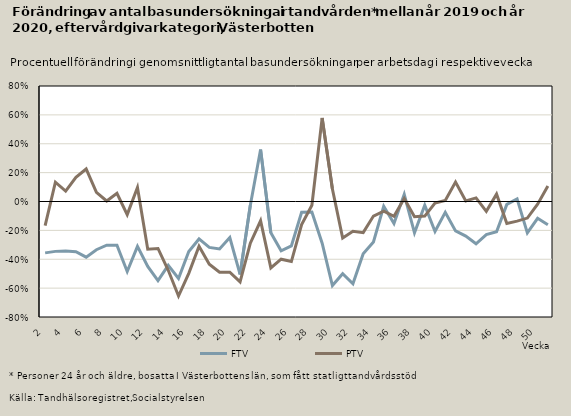
| Category | FTV | PTV |
|---|---|---|
| 2.0 | -0.356 | -0.168 |
| 3.0 | -0.345 | 0.133 |
| 4.0 | -0.343 | 0.072 |
| 5.0 | -0.348 | 0.168 |
| 6.0 | -0.386 | 0.225 |
| 7.0 | -0.334 | 0.063 |
| 8.0 | -0.303 | 0.004 |
| 9.0 | -0.303 | 0.057 |
| 10.0 | -0.485 | -0.091 |
| 11.0 | -0.311 | 0.096 |
| 12.0 | -0.449 | -0.331 |
| 13.0 | -0.548 | -0.325 |
| 14.0 | -0.443 | -0.476 |
| 15.0 | -0.534 | -0.655 |
| 16.0 | -0.346 | -0.498 |
| 17.0 | -0.259 | -0.31 |
| 18.0 | -0.318 | -0.434 |
| 19.0 | -0.329 | -0.49 |
| 20.0 | -0.25 | -0.49 |
| 21.0 | -0.505 | -0.557 |
| 22.0 | -0.026 | -0.288 |
| 23.0 | 0.359 | -0.133 |
| 24.0 | -0.217 | -0.46 |
| 25.0 | -0.342 | -0.399 |
| 26.0 | -0.308 | -0.416 |
| 27.0 | -0.075 | -0.16 |
| 28.0 | -0.072 | -0.026 |
| 29.0 | -0.289 | 0.579 |
| 30.0 | -0.582 | 0.087 |
| 31.0 | -0.5 | -0.254 |
| 32.0 | -0.57 | -0.207 |
| 33.0 | -0.362 | -0.216 |
| 34.0 | -0.28 | -0.101 |
| 35.0 | -0.033 | -0.067 |
| 36.0 | -0.152 | -0.102 |
| 37.0 | 0.05 | 0.021 |
| 38.0 | -0.217 | -0.105 |
| 39.0 | -0.026 | -0.101 |
| 40.0 | -0.208 | -0.011 |
| 41.0 | -0.075 | 0.008 |
| 42.0 | -0.204 | 0.134 |
| 43.0 | -0.239 | 0.004 |
| 44.0 | -0.293 | 0.025 |
| 45.0 | -0.229 | -0.069 |
| 46.0 | -0.209 | 0.051 |
| 47.0 | -0.02 | -0.152 |
| 48.0 | 0.018 | -0.136 |
| 49.0 | -0.217 | -0.115 |
| 50.0 | -0.116 | -0.019 |
| 51.0 | -0.162 | 0.107 |